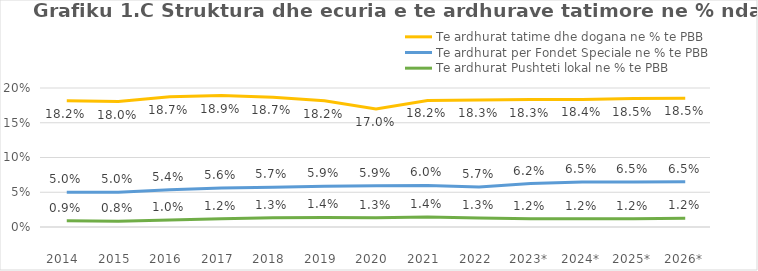
| Category | Te ardhurat tatime dhe dogana ne % te PBB | Te ardhurat per Fondet Speciale ne % te PBB | Te ardhurat Pushteti lokal ne % te PBB |
|---|---|---|---|
| 2014  | 0.182 | 0.05 | 0.009 |
| 2015  | 0.18 | 0.05 | 0.008 |
| 2016  | 0.187 | 0.054 | 0.01 |
| 2017  | 0.189 | 0.056 | 0.012 |
| 2018  | 0.187 | 0.057 | 0.013 |
| 2019  | 0.182 | 0.059 | 0.014 |
| 2020  | 0.17 | 0.059 | 0.013 |
| 2021  | 0.182 | 0.06 | 0.014 |
| 2022  | 0.183 | 0.057 | 0.013 |
| 2023* | 0.183 | 0.062 | 0.012 |
| 2024* | 0.184 | 0.065 | 0.012 |
| 2025* | 0.185 | 0.065 | 0.012 |
| 2026* | 0.185 | 0.065 | 0.012 |